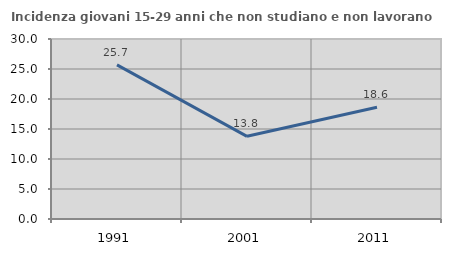
| Category | Incidenza giovani 15-29 anni che non studiano e non lavorano  |
|---|---|
| 1991.0 | 25.687 |
| 2001.0 | 13.78 |
| 2011.0 | 18.636 |